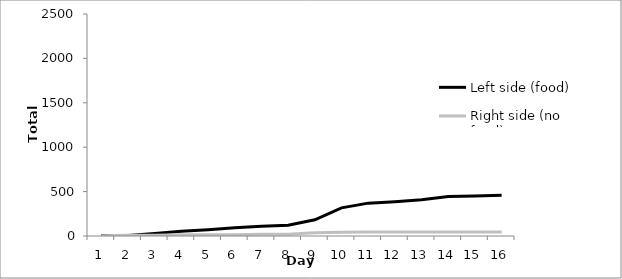
| Category | Left side (food) | Right side (no food) |
|---|---|---|
| 0 | 6 | 3 |
| 1 | 7 | 8 |
| 2 | 28 | 9 |
| 3 | 53 | 13 |
| 4 | 70 | 13 |
| 5 | 92 | 15 |
| 6 | 110 | 20 |
| 7 | 121 | 20 |
| 8 | 182 | 37 |
| 9 | 317 | 42 |
| 10 | 370 | 44 |
| 11 | 387 | 45 |
| 12 | 407 | 45 |
| 13 | 446 | 45 |
| 14 | 450 | 46 |
| 15 | 458 | 46 |